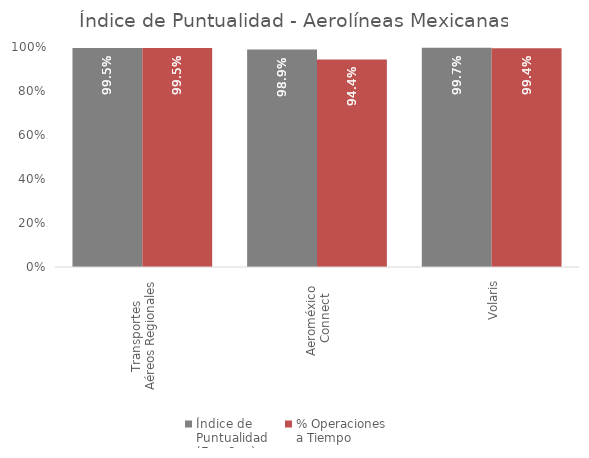
| Category | Índice de 
Puntualidad
(Ene-Sep) | % Operaciones 
a Tiempo |
|---|---|---|
| Transportes 
Aéreos Regionales | 0.995 | 0.995 |
| Aeroméxico 
Connect | 0.989 | 0.944 |
| Volaris | 0.997 | 0.994 |